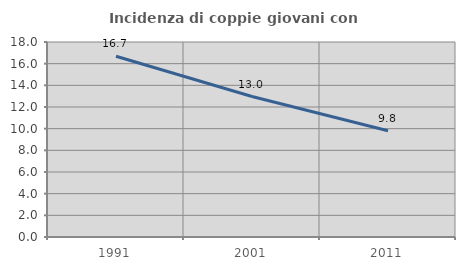
| Category | Incidenza di coppie giovani con figli |
|---|---|
| 1991.0 | 16.688 |
| 2001.0 | 12.964 |
| 2011.0 | 9.8 |